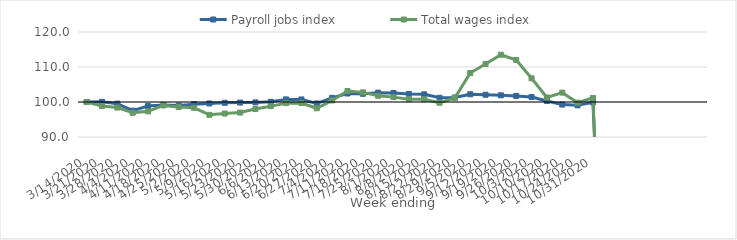
| Category | Payroll jobs index | Total wages index |
|---|---|---|
| 14/03/2020 | 100 | 100 |
| 21/03/2020 | 100.042 | 98.832 |
| 28/03/2020 | 99.523 | 98.407 |
| 04/04/2020 | 97.519 | 96.906 |
| 11/04/2020 | 98.854 | 97.335 |
| 18/04/2020 | 99.117 | 99.029 |
| 25/04/2020 | 98.969 | 98.586 |
| 02/05/2020 | 99.39 | 98.344 |
| 09/05/2020 | 99.581 | 96.343 |
| 16/05/2020 | 99.778 | 96.702 |
| 23/05/2020 | 99.836 | 96.978 |
| 30/05/2020 | 99.886 | 98 |
| 06/06/2020 | 100.05 | 98.811 |
| 13/06/2020 | 100.746 | 99.676 |
| 20/06/2020 | 100.724 | 99.686 |
| 27/06/2020 | 99.587 | 98.211 |
| 04/07/2020 | 101.189 | 100.443 |
| 11/07/2020 | 102.431 | 103.141 |
| 18/07/2020 | 102.338 | 102.753 |
| 25/07/2020 | 102.674 | 101.782 |
| 01/08/2020 | 102.567 | 101.393 |
| 08/08/2020 | 102.286 | 100.817 |
| 15/08/2020 | 102.188 | 100.806 |
| 22/08/2020 | 101.208 | 99.794 |
| 29/08/2020 | 101.298 | 101.168 |
| 05/09/2020 | 102.209 | 108.271 |
| 12/09/2020 | 102.072 | 110.85 |
| 19/09/2020 | 101.914 | 113.51 |
| 26/09/2020 | 101.733 | 112.008 |
| 03/10/2020 | 101.439 | 106.766 |
| 10/10/2020 | 100.307 | 101.278 |
| 17/10/2020 | 99.261 | 102.68 |
| 24/10/2020 | 99.043 | 99.806 |
| 31/10/2020 | 99.899 | 101.178 |